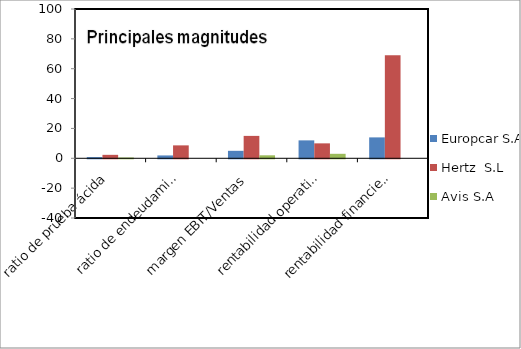
| Category | Europcar S.A | Hertz  S.L | Avis S.A |
|---|---|---|---|
| ratio de prueba ácida | 0.81 | 2.31 | 0.54 |
| ratio de endeudamiento | 1.91 | 8.65 | 0 |
| margen EBIT/Ventas | 5 | 15 | 2 |
| rentabilidad operativa (ROI) | 12 | 10 | 3 |
| rentabilidad financiera (ROE) | 14 | 69 | 0 |